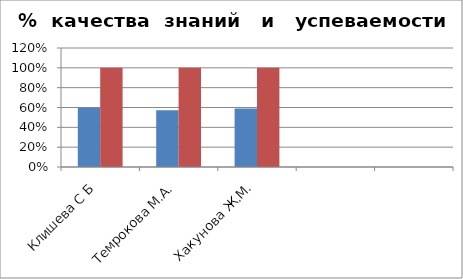
| Category | Series 0 | 2 |
|---|---|---|
| Клишева С Б | 0.597 | 1 |
| Темрокова М.А. | 0.571 | 1 |
| Хакунова Ж.М. | 0.589 | 1 |